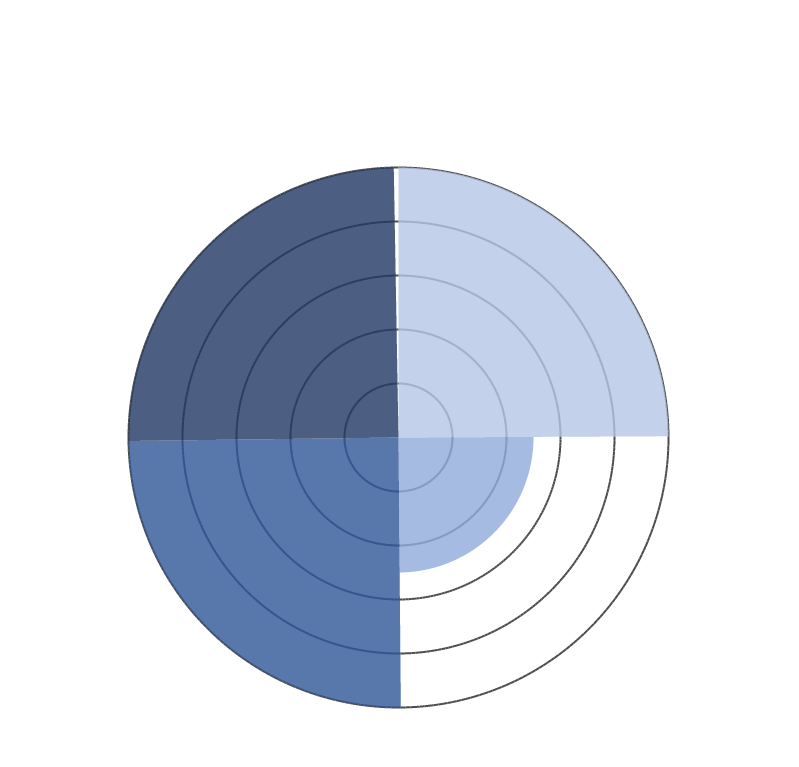
| Category | Fossiele brandstof in zware voertuigen | Overige vraag naar waterstof | Bellenbeluchting | Zuurstofvraag |
|---|---|---|---|---|
| 0 | 10 | 0 | 0 | 0 |
| 1 | 10 | 0 | 0 | 0 |
| 2 | 10 | 0 | 0 | 0 |
| 3 | 10 | 0 | 0 | 0 |
| 4 | 10 | 0 | 0 | 0 |
| 5 | 10 | 0 | 0 | 0 |
| 6 | 10 | 0 | 0 | 0 |
| 7 | 10 | 0 | 0 | 0 |
| 8 | 10 | 0 | 0 | 0 |
| 9 | 10 | 0 | 0 | 0 |
| 10 | 10 | 0 | 0 | 0 |
| 11 | 10 | 0 | 0 | 0 |
| 12 | 10 | 0 | 0 | 0 |
| 13 | 10 | 0 | 0 | 0 |
| 14 | 10 | 0 | 0 | 0 |
| 15 | 10 | 0 | 0 | 0 |
| 16 | 10 | 0 | 0 | 0 |
| 17 | 10 | 0 | 0 | 0 |
| 18 | 10 | 0 | 0 | 0 |
| 19 | 10 | 0 | 0 | 0 |
| 20 | 10 | 0 | 0 | 0 |
| 21 | 10 | 0 | 0 | 0 |
| 22 | 10 | 0 | 0 | 0 |
| 23 | 10 | 0 | 0 | 0 |
| 24 | 10 | 0 | 0 | 0 |
| 25 | 10 | 0 | 0 | 0 |
| 26 | 10 | 0 | 0 | 0 |
| 27 | 10 | 0 | 0 | 0 |
| 28 | 10 | 0 | 0 | 0 |
| 29 | 10 | 0 | 0 | 0 |
| 30 | 10 | 0 | 0 | 0 |
| 31 | 10 | 0 | 0 | 0 |
| 32 | 10 | 0 | 0 | 0 |
| 33 | 10 | 0 | 0 | 0 |
| 34 | 10 | 0 | 0 | 0 |
| 35 | 10 | 0 | 0 | 0 |
| 36 | 10 | 0 | 0 | 0 |
| 37 | 10 | 0 | 0 | 0 |
| 38 | 10 | 0 | 0 | 0 |
| 39 | 10 | 0 | 0 | 0 |
| 40 | 10 | 0 | 0 | 0 |
| 41 | 10 | 0 | 0 | 0 |
| 42 | 10 | 0 | 0 | 0 |
| 43 | 10 | 0 | 0 | 0 |
| 44 | 10 | 0 | 0 | 0 |
| 45 | 10 | 0 | 0 | 0 |
| 46 | 10 | 0 | 0 | 0 |
| 47 | 10 | 0 | 0 | 0 |
| 48 | 10 | 0 | 0 | 0 |
| 49 | 10 | 0 | 0 | 0 |
| 50 | 10 | 0 | 0 | 0 |
| 51 | 10 | 0 | 0 | 0 |
| 52 | 10 | 0 | 0 | 0 |
| 53 | 10 | 0 | 0 | 0 |
| 54 | 10 | 0 | 0 | 0 |
| 55 | 10 | 0 | 0 | 0 |
| 56 | 10 | 0 | 0 | 0 |
| 57 | 10 | 0 | 0 | 0 |
| 58 | 10 | 0 | 0 | 0 |
| 59 | 10 | 0 | 0 | 0 |
| 60 | 10 | 0 | 0 | 0 |
| 61 | 10 | 0 | 0 | 0 |
| 62 | 10 | 0 | 0 | 0 |
| 63 | 10 | 0 | 0 | 0 |
| 64 | 10 | 0 | 0 | 0 |
| 65 | 10 | 0 | 0 | 0 |
| 66 | 10 | 0 | 0 | 0 |
| 67 | 10 | 0 | 0 | 0 |
| 68 | 10 | 0 | 0 | 0 |
| 69 | 10 | 0 | 0 | 0 |
| 70 | 10 | 0 | 0 | 0 |
| 71 | 10 | 0 | 0 | 0 |
| 72 | 10 | 0 | 0 | 0 |
| 73 | 10 | 0 | 0 | 0 |
| 74 | 10 | 0 | 0 | 0 |
| 75 | 10 | 0 | 0 | 0 |
| 76 | 10 | 0 | 0 | 0 |
| 77 | 10 | 0 | 0 | 0 |
| 78 | 10 | 0 | 0 | 0 |
| 79 | 10 | 0 | 0 | 0 |
| 80 | 10 | 0 | 0 | 0 |
| 81 | 10 | 0 | 0 | 0 |
| 82 | 10 | 0 | 0 | 0 |
| 83 | 10 | 0 | 0 | 0 |
| 84 | 10 | 0 | 0 | 0 |
| 85 | 10 | 0 | 0 | 0 |
| 86 | 10 | 0 | 0 | 0 |
| 87 | 10 | 0 | 0 | 0 |
| 88 | 10 | 0 | 0 | 0 |
| 89 | 10 | 0 | 0 | 0 |
| 90 | 10 | 5 | 0 | 0 |
| 91 | 0 | 5 | 0 | 0 |
| 92 | 0 | 5 | 0 | 0 |
| 93 | 0 | 5 | 0 | 0 |
| 94 | 0 | 5 | 0 | 0 |
| 95 | 0 | 5 | 0 | 0 |
| 96 | 0 | 5 | 0 | 0 |
| 97 | 0 | 5 | 0 | 0 |
| 98 | 0 | 5 | 0 | 0 |
| 99 | 0 | 5 | 0 | 0 |
| 100 | 0 | 5 | 0 | 0 |
| 101 | 0 | 5 | 0 | 0 |
| 102 | 0 | 5 | 0 | 0 |
| 103 | 0 | 5 | 0 | 0 |
| 104 | 0 | 5 | 0 | 0 |
| 105 | 0 | 5 | 0 | 0 |
| 106 | 0 | 5 | 0 | 0 |
| 107 | 0 | 5 | 0 | 0 |
| 108 | 0 | 5 | 0 | 0 |
| 109 | 0 | 5 | 0 | 0 |
| 110 | 0 | 5 | 0 | 0 |
| 111 | 0 | 5 | 0 | 0 |
| 112 | 0 | 5 | 0 | 0 |
| 113 | 0 | 5 | 0 | 0 |
| 114 | 0 | 5 | 0 | 0 |
| 115 | 0 | 5 | 0 | 0 |
| 116 | 0 | 5 | 0 | 0 |
| 117 | 0 | 5 | 0 | 0 |
| 118 | 0 | 5 | 0 | 0 |
| 119 | 0 | 5 | 0 | 0 |
| 120 | 0 | 5 | 0 | 0 |
| 121 | 0 | 5 | 0 | 0 |
| 122 | 0 | 5 | 0 | 0 |
| 123 | 0 | 5 | 0 | 0 |
| 124 | 0 | 5 | 0 | 0 |
| 125 | 0 | 5 | 0 | 0 |
| 126 | 0 | 5 | 0 | 0 |
| 127 | 0 | 5 | 0 | 0 |
| 128 | 0 | 5 | 0 | 0 |
| 129 | 0 | 5 | 0 | 0 |
| 130 | 0 | 5 | 0 | 0 |
| 131 | 0 | 5 | 0 | 0 |
| 132 | 0 | 5 | 0 | 0 |
| 133 | 0 | 5 | 0 | 0 |
| 134 | 0 | 5 | 0 | 0 |
| 135 | 0 | 5 | 0 | 0 |
| 136 | 0 | 5 | 0 | 0 |
| 137 | 0 | 5 | 0 | 0 |
| 138 | 0 | 5 | 0 | 0 |
| 139 | 0 | 5 | 0 | 0 |
| 140 | 0 | 5 | 0 | 0 |
| 141 | 0 | 5 | 0 | 0 |
| 142 | 0 | 5 | 0 | 0 |
| 143 | 0 | 5 | 0 | 0 |
| 144 | 0 | 5 | 0 | 0 |
| 145 | 0 | 5 | 0 | 0 |
| 146 | 0 | 5 | 0 | 0 |
| 147 | 0 | 5 | 0 | 0 |
| 148 | 0 | 5 | 0 | 0 |
| 149 | 0 | 5 | 0 | 0 |
| 150 | 0 | 5 | 0 | 0 |
| 151 | 0 | 5 | 0 | 0 |
| 152 | 0 | 5 | 0 | 0 |
| 153 | 0 | 5 | 0 | 0 |
| 154 | 0 | 5 | 0 | 0 |
| 155 | 0 | 5 | 0 | 0 |
| 156 | 0 | 5 | 0 | 0 |
| 157 | 0 | 5 | 0 | 0 |
| 158 | 0 | 5 | 0 | 0 |
| 159 | 0 | 5 | 0 | 0 |
| 160 | 0 | 5 | 0 | 0 |
| 161 | 0 | 5 | 0 | 0 |
| 162 | 0 | 5 | 0 | 0 |
| 163 | 0 | 5 | 0 | 0 |
| 164 | 0 | 5 | 0 | 0 |
| 165 | 0 | 5 | 0 | 0 |
| 166 | 0 | 5 | 0 | 0 |
| 167 | 0 | 5 | 0 | 0 |
| 168 | 0 | 5 | 0 | 0 |
| 169 | 0 | 5 | 0 | 0 |
| 170 | 0 | 5 | 0 | 0 |
| 171 | 0 | 5 | 0 | 0 |
| 172 | 0 | 5 | 0 | 0 |
| 173 | 0 | 5 | 0 | 0 |
| 174 | 0 | 5 | 0 | 0 |
| 175 | 0 | 5 | 0 | 0 |
| 176 | 0 | 5 | 0 | 0 |
| 177 | 0 | 5 | 0 | 0 |
| 178 | 0 | 5 | 0 | 0 |
| 179 | 0 | 5 | 0 | 0 |
| 180 | 0 | 5 | 10 | 0 |
| 181 | 0 | 0 | 10 | 0 |
| 182 | 0 | 0 | 10 | 0 |
| 183 | 0 | 0 | 10 | 0 |
| 184 | 0 | 0 | 10 | 0 |
| 185 | 0 | 0 | 10 | 0 |
| 186 | 0 | 0 | 10 | 0 |
| 187 | 0 | 0 | 10 | 0 |
| 188 | 0 | 0 | 10 | 0 |
| 189 | 0 | 0 | 10 | 0 |
| 190 | 0 | 0 | 10 | 0 |
| 191 | 0 | 0 | 10 | 0 |
| 192 | 0 | 0 | 10 | 0 |
| 193 | 0 | 0 | 10 | 0 |
| 194 | 0 | 0 | 10 | 0 |
| 195 | 0 | 0 | 10 | 0 |
| 196 | 0 | 0 | 10 | 0 |
| 197 | 0 | 0 | 10 | 0 |
| 198 | 0 | 0 | 10 | 0 |
| 199 | 0 | 0 | 10 | 0 |
| 200 | 0 | 0 | 10 | 0 |
| 201 | 0 | 0 | 10 | 0 |
| 202 | 0 | 0 | 10 | 0 |
| 203 | 0 | 0 | 10 | 0 |
| 204 | 0 | 0 | 10 | 0 |
| 205 | 0 | 0 | 10 | 0 |
| 206 | 0 | 0 | 10 | 0 |
| 207 | 0 | 0 | 10 | 0 |
| 208 | 0 | 0 | 10 | 0 |
| 209 | 0 | 0 | 10 | 0 |
| 210 | 0 | 0 | 10 | 0 |
| 211 | 0 | 0 | 10 | 0 |
| 212 | 0 | 0 | 10 | 0 |
| 213 | 0 | 0 | 10 | 0 |
| 214 | 0 | 0 | 10 | 0 |
| 215 | 0 | 0 | 10 | 0 |
| 216 | 0 | 0 | 10 | 0 |
| 217 | 0 | 0 | 10 | 0 |
| 218 | 0 | 0 | 10 | 0 |
| 219 | 0 | 0 | 10 | 0 |
| 220 | 0 | 0 | 10 | 0 |
| 221 | 0 | 0 | 10 | 0 |
| 222 | 0 | 0 | 10 | 0 |
| 223 | 0 | 0 | 10 | 0 |
| 224 | 0 | 0 | 10 | 0 |
| 225 | 0 | 0 | 10 | 0 |
| 226 | 0 | 0 | 10 | 0 |
| 227 | 0 | 0 | 10 | 0 |
| 228 | 0 | 0 | 10 | 0 |
| 229 | 0 | 0 | 10 | 0 |
| 230 | 0 | 0 | 10 | 0 |
| 231 | 0 | 0 | 10 | 0 |
| 232 | 0 | 0 | 10 | 0 |
| 233 | 0 | 0 | 10 | 0 |
| 234 | 0 | 0 | 10 | 0 |
| 235 | 0 | 0 | 10 | 0 |
| 236 | 0 | 0 | 10 | 0 |
| 237 | 0 | 0 | 10 | 0 |
| 238 | 0 | 0 | 10 | 0 |
| 239 | 0 | 0 | 10 | 0 |
| 240 | 0 | 0 | 10 | 0 |
| 241 | 0 | 0 | 10 | 0 |
| 242 | 0 | 0 | 10 | 0 |
| 243 | 0 | 0 | 10 | 0 |
| 244 | 0 | 0 | 10 | 0 |
| 245 | 0 | 0 | 10 | 0 |
| 246 | 0 | 0 | 10 | 0 |
| 247 | 0 | 0 | 10 | 0 |
| 248 | 0 | 0 | 10 | 0 |
| 249 | 0 | 0 | 10 | 0 |
| 250 | 0 | 0 | 10 | 0 |
| 251 | 0 | 0 | 10 | 0 |
| 252 | 0 | 0 | 10 | 0 |
| 253 | 0 | 0 | 10 | 0 |
| 254 | 0 | 0 | 10 | 0 |
| 255 | 0 | 0 | 10 | 0 |
| 256 | 0 | 0 | 10 | 0 |
| 257 | 0 | 0 | 10 | 0 |
| 258 | 0 | 0 | 10 | 0 |
| 259 | 0 | 0 | 10 | 0 |
| 260 | 0 | 0 | 10 | 0 |
| 261 | 0 | 0 | 10 | 0 |
| 262 | 0 | 0 | 10 | 0 |
| 263 | 0 | 0 | 10 | 0 |
| 264 | 0 | 0 | 10 | 0 |
| 265 | 0 | 0 | 10 | 0 |
| 266 | 0 | 0 | 10 | 0 |
| 267 | 0 | 0 | 10 | 0 |
| 268 | 0 | 0 | 10 | 0 |
| 269 | 0 | 0 | 10 | 0 |
| 270 | 0 | 0 | 10 | 0 |
| 271 | 0 | 0 | 0 | 0 |
| 272 | 0 | 0 | 0 | 0 |
| 273 | 0 | 0 | 0 | 0 |
| 274 | 0 | 0 | 0 | 0 |
| 275 | 0 | 0 | 0 | 0 |
| 276 | 0 | 0 | 0 | 0 |
| 277 | 0 | 0 | 0 | 0 |
| 278 | 0 | 0 | 0 | 0 |
| 279 | 0 | 0 | 0 | 0 |
| 280 | 0 | 0 | 0 | 0 |
| 281 | 0 | 0 | 0 | 0 |
| 282 | 0 | 0 | 0 | 0 |
| 283 | 0 | 0 | 0 | 0 |
| 284 | 0 | 0 | 0 | 0 |
| 285 | 0 | 0 | 0 | 0 |
| 286 | 0 | 0 | 0 | 0 |
| 287 | 0 | 0 | 0 | 0 |
| 288 | 0 | 0 | 0 | 0 |
| 289 | 0 | 0 | 0 | 0 |
| 290 | 0 | 0 | 0 | 0 |
| 291 | 0 | 0 | 0 | 0 |
| 292 | 0 | 0 | 0 | 0 |
| 293 | 0 | 0 | 0 | 0 |
| 294 | 0 | 0 | 0 | 0 |
| 295 | 0 | 0 | 0 | 0 |
| 296 | 0 | 0 | 0 | 0 |
| 297 | 0 | 0 | 0 | 0 |
| 298 | 0 | 0 | 0 | 0 |
| 299 | 0 | 0 | 0 | 0 |
| 300 | 0 | 0 | 0 | 0 |
| 301 | 0 | 0 | 0 | 0 |
| 302 | 0 | 0 | 0 | 0 |
| 303 | 0 | 0 | 0 | 0 |
| 304 | 0 | 0 | 0 | 0 |
| 305 | 0 | 0 | 0 | 0 |
| 306 | 0 | 0 | 0 | 0 |
| 307 | 0 | 0 | 0 | 0 |
| 308 | 0 | 0 | 0 | 0 |
| 309 | 0 | 0 | 0 | 0 |
| 310 | 0 | 0 | 0 | 0 |
| 311 | 0 | 0 | 0 | 0 |
| 312 | 0 | 0 | 0 | 0 |
| 313 | 0 | 0 | 0 | 0 |
| 314 | 0 | 0 | 0 | 0 |
| 315 | 0 | 0 | 0 | 0 |
| 316 | 0 | 0 | 0 | 0 |
| 317 | 0 | 0 | 0 | 0 |
| 318 | 0 | 0 | 0 | 0 |
| 319 | 0 | 0 | 0 | 0 |
| 320 | 0 | 0 | 0 | 0 |
| 321 | 0 | 0 | 0 | 0 |
| 322 | 0 | 0 | 0 | 0 |
| 323 | 0 | 0 | 0 | 0 |
| 324 | 0 | 0 | 0 | 0 |
| 325 | 0 | 0 | 0 | 0 |
| 326 | 0 | 0 | 0 | 0 |
| 327 | 0 | 0 | 0 | 0 |
| 328 | 0 | 0 | 0 | 0 |
| 329 | 0 | 0 | 0 | 0 |
| 330 | 0 | 0 | 0 | 0 |
| 331 | 0 | 0 | 0 | 0 |
| 332 | 0 | 0 | 0 | 0 |
| 333 | 0 | 0 | 0 | 0 |
| 334 | 0 | 0 | 0 | 0 |
| 335 | 0 | 0 | 0 | 0 |
| 336 | 0 | 0 | 0 | 0 |
| 337 | 0 | 0 | 0 | 0 |
| 338 | 0 | 0 | 0 | 0 |
| 339 | 0 | 0 | 0 | 0 |
| 340 | 0 | 0 | 0 | 0 |
| 341 | 0 | 0 | 0 | 0 |
| 342 | 0 | 0 | 0 | 0 |
| 343 | 0 | 0 | 0 | 0 |
| 344 | 0 | 0 | 0 | 0 |
| 345 | 0 | 0 | 0 | 0 |
| 346 | 0 | 0 | 0 | 0 |
| 347 | 0 | 0 | 0 | 0 |
| 348 | 0 | 0 | 0 | 0 |
| 349 | 0 | 0 | 0 | 0 |
| 350 | 0 | 0 | 0 | 0 |
| 351 | 0 | 0 | 0 | 0 |
| 352 | 0 | 0 | 0 | 0 |
| 353 | 0 | 0 | 0 | 0 |
| 354 | 0 | 0 | 0 | 0 |
| 355 | 0 | 0 | 0 | 0 |
| 356 | 0 | 0 | 0 | 0 |
| 357 | 0 | 0 | 0 | 0 |
| 358 | 0 | 0 | 0 | 0 |
| 359 | 0 | 0 | 0 | 0 |
| 360 | 0 | 0 | 0 | 10 |